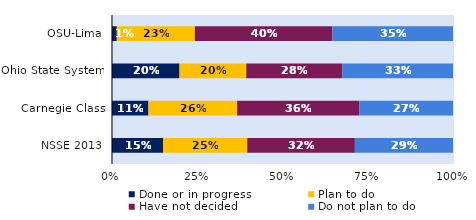
| Category | Done or in progress | Plan to do | Have not decided | Do not plan to do |
|---|---|---|---|---|
| OSU-Lima | 0.014 | 0.229 | 0.403 | 0.354 |
| Ohio State System | 0.198 | 0.196 | 0.281 | 0.325 |
| Carnegie Class | 0.107 | 0.26 | 0.359 | 0.274 |
| NSSE 2013 | 0.15 | 0.247 | 0.316 | 0.288 |